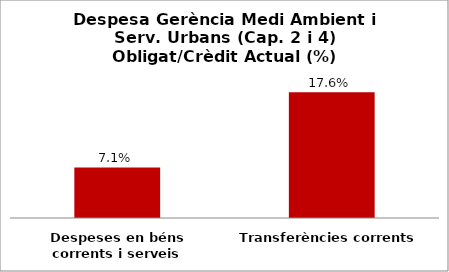
| Category | Series 0 |
|---|---|
| Despeses en béns corrents i serveis | 0.071 |
| Transferències corrents | 0.176 |